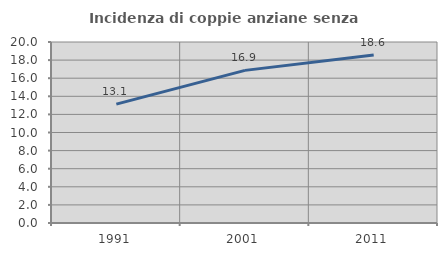
| Category | Incidenza di coppie anziane senza figli  |
|---|---|
| 1991.0 | 13.139 |
| 2001.0 | 16.865 |
| 2011.0 | 18.57 |